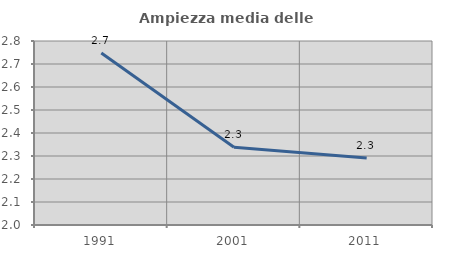
| Category | Ampiezza media delle famiglie |
|---|---|
| 1991.0 | 2.748 |
| 2001.0 | 2.338 |
| 2011.0 | 2.291 |